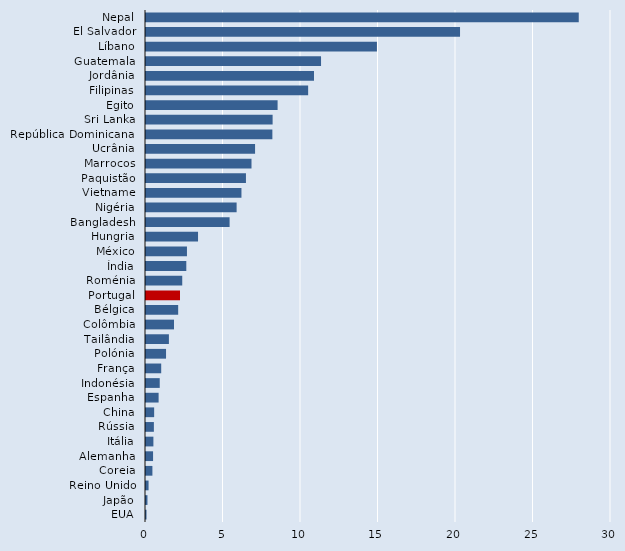
| Category | Series 2 |
|---|---|
| Nepal | 27.92 |
| El Salvador | 20.26 |
| Líbano | 14.898 |
| Guatemala | 11.293 |
| Jordânia | 10.838 |
| Filipinas | 10.461 |
| Egito | 8.49 |
| Sri Lanka | 8.168 |
| República Dominicana  | 8.153 |
| Ucrânia | 7.037 |
| Marrocos | 6.806 |
| Paquistão | 6.448 |
| Vietname | 6.158 |
| Nigéria | 5.846 |
| Bangladesh | 5.394 |
| Hungria | 3.357 |
| México | 2.642 |
| Índia | 2.6 |
| Roménia | 2.338 |
| Portugal | 2.194 |
| Bélgica | 2.076 |
| Colômbia | 1.808 |
| Tailândia | 1.478 |
| Polónia | 1.293 |
| França | 0.981 |
| Indonésia | 0.886 |
| Espanha | 0.814 |
| China | 0.526 |
| Rússia | 0.508 |
| Itália | 0.477 |
| Alemanha | 0.456 |
| Coreia | 0.414 |
| Reino Unido | 0.166 |
| Japão | 0.094 |
| EUA | 0.034 |